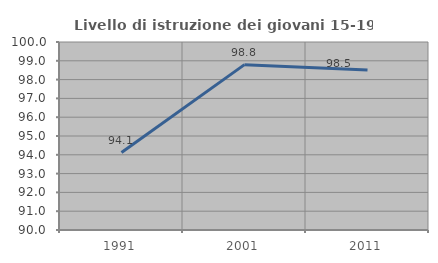
| Category | Livello di istruzione dei giovani 15-19 anni |
|---|---|
| 1991.0 | 94.118 |
| 2001.0 | 98.795 |
| 2011.0 | 98.507 |